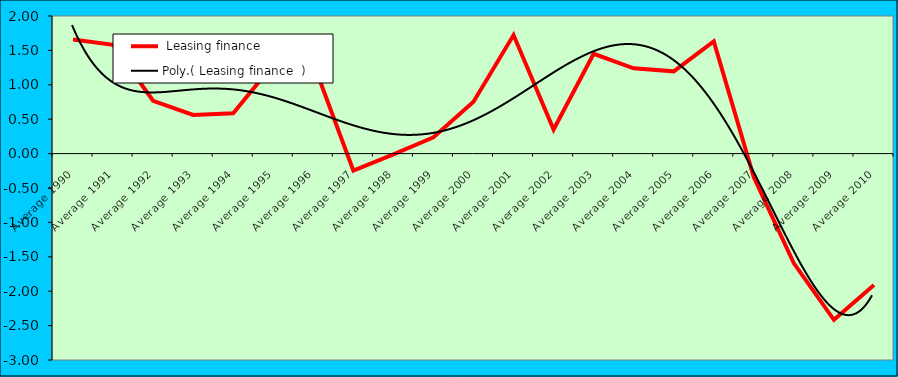
| Category |  Leasing finance   |
|---|---|
| Average 1990 | 1.659 |
| Average 1991 | 1.582 |
| Average 1992 | 0.768 |
| Average 1993 | 0.562 |
| Average 1994 | 0.587 |
| Average 1995 | 1.297 |
| Average 1996 | 1.318 |
| Average 1997 | -0.247 |
| Average 1998 | -0.01 |
| Average 1999 | 0.237 |
| Average 2000 | 0.755 |
| Average 2001 | 1.723 |
| Average 2002 | 0.35 |
| Average 2003 | 1.451 |
| Average 2004 | 1.24 |
| Average 2005 | 1.195 |
| Average 2006 | 1.63 |
| Average 2007 | -0.346 |
| Average 2008 | -1.595 |
| Average 2009 | -2.417 |
| Average 2010 | -1.911 |